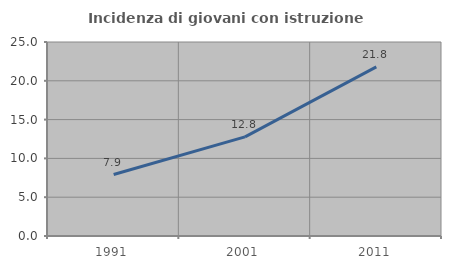
| Category | Incidenza di giovani con istruzione universitaria |
|---|---|
| 1991.0 | 7.919 |
| 2001.0 | 12.771 |
| 2011.0 | 21.803 |